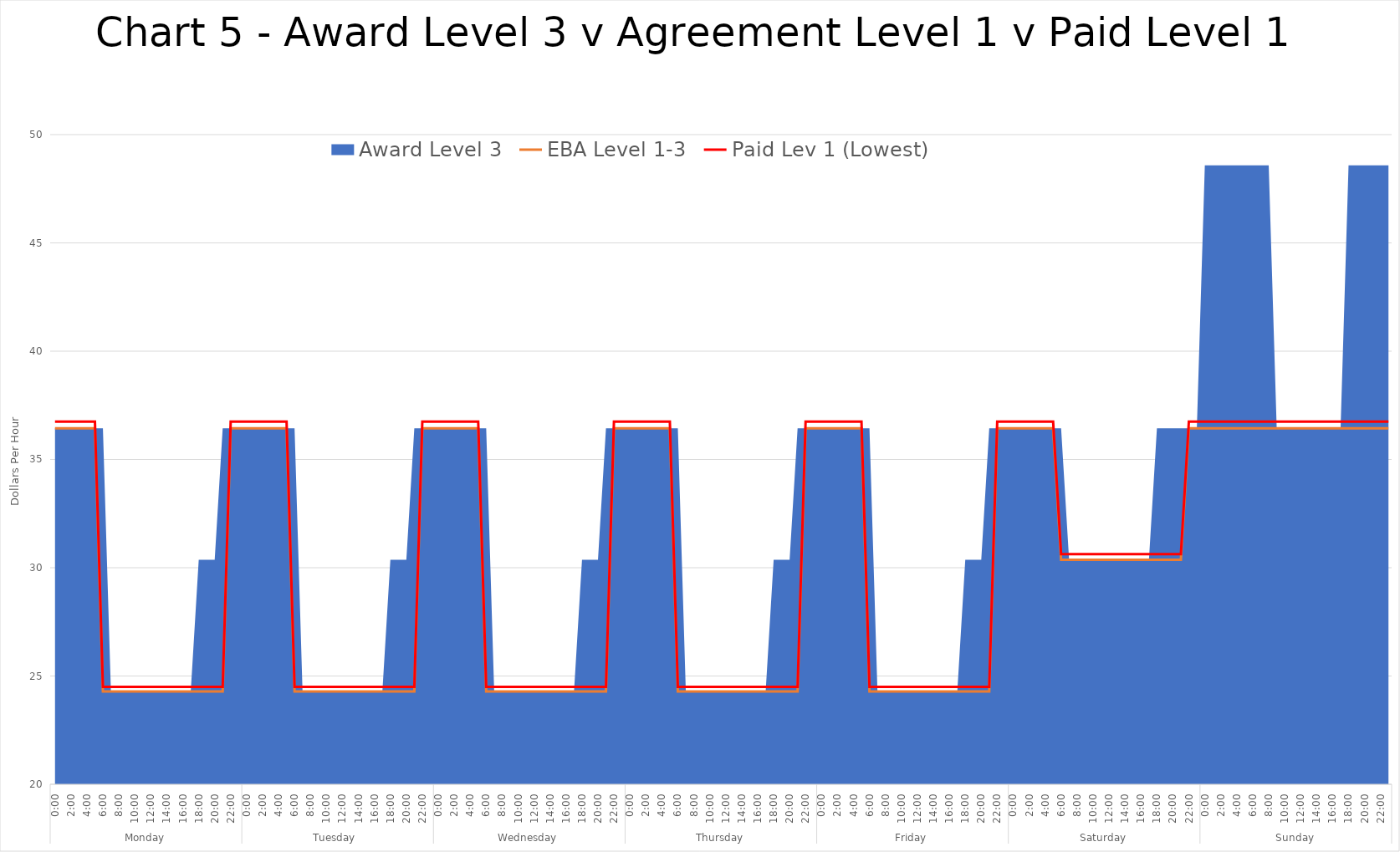
| Category | EBA Level 1-3 | Paid Lev 1 (Lowest) |
|---|---|---|
| 0 | 36.435 | 36.75 |
| 1 | 36.435 | 36.75 |
| 2 | 36.435 | 36.75 |
| 3 | 36.435 | 36.75 |
| 4 | 36.435 | 36.75 |
| 5 | 36.435 | 36.75 |
| 6 | 24.29 | 24.5 |
| 7 | 24.29 | 24.5 |
| 8 | 24.29 | 24.5 |
| 9 | 24.29 | 24.5 |
| 10 | 24.29 | 24.5 |
| 11 | 24.29 | 24.5 |
| 12 | 24.29 | 24.5 |
| 13 | 24.29 | 24.5 |
| 14 | 24.29 | 24.5 |
| 15 | 24.29 | 24.5 |
| 16 | 24.29 | 24.5 |
| 17 | 24.29 | 24.5 |
| 18 | 24.29 | 24.5 |
| 19 | 24.29 | 24.5 |
| 20 | 24.29 | 24.5 |
| 21 | 24.29 | 24.5 |
| 22 | 36.435 | 36.75 |
| 23 | 36.435 | 36.75 |
| 24 | 36.435 | 36.75 |
| 25 | 36.435 | 36.75 |
| 26 | 36.435 | 36.75 |
| 27 | 36.435 | 36.75 |
| 28 | 36.435 | 36.75 |
| 29 | 36.435 | 36.75 |
| 30 | 24.29 | 24.5 |
| 31 | 24.29 | 24.5 |
| 32 | 24.29 | 24.5 |
| 33 | 24.29 | 24.5 |
| 34 | 24.29 | 24.5 |
| 35 | 24.29 | 24.5 |
| 36 | 24.29 | 24.5 |
| 37 | 24.29 | 24.5 |
| 38 | 24.29 | 24.5 |
| 39 | 24.29 | 24.5 |
| 40 | 24.29 | 24.5 |
| 41 | 24.29 | 24.5 |
| 42 | 24.29 | 24.5 |
| 43 | 24.29 | 24.5 |
| 44 | 24.29 | 24.5 |
| 45 | 24.29 | 24.5 |
| 46 | 36.435 | 36.75 |
| 47 | 36.435 | 36.75 |
| 48 | 36.435 | 36.75 |
| 49 | 36.435 | 36.75 |
| 50 | 36.435 | 36.75 |
| 51 | 36.435 | 36.75 |
| 52 | 36.435 | 36.75 |
| 53 | 36.435 | 36.75 |
| 54 | 24.29 | 24.5 |
| 55 | 24.29 | 24.5 |
| 56 | 24.29 | 24.5 |
| 57 | 24.29 | 24.5 |
| 58 | 24.29 | 24.5 |
| 59 | 24.29 | 24.5 |
| 60 | 24.29 | 24.5 |
| 61 | 24.29 | 24.5 |
| 62 | 24.29 | 24.5 |
| 63 | 24.29 | 24.5 |
| 64 | 24.29 | 24.5 |
| 65 | 24.29 | 24.5 |
| 66 | 24.29 | 24.5 |
| 67 | 24.29 | 24.5 |
| 68 | 24.29 | 24.5 |
| 69 | 24.29 | 24.5 |
| 70 | 36.435 | 36.75 |
| 71 | 36.435 | 36.75 |
| 72 | 36.435 | 36.75 |
| 73 | 36.435 | 36.75 |
| 74 | 36.435 | 36.75 |
| 75 | 36.435 | 36.75 |
| 76 | 36.435 | 36.75 |
| 77 | 36.435 | 36.75 |
| 78 | 24.29 | 24.5 |
| 79 | 24.29 | 24.5 |
| 80 | 24.29 | 24.5 |
| 81 | 24.29 | 24.5 |
| 82 | 24.29 | 24.5 |
| 83 | 24.29 | 24.5 |
| 84 | 24.29 | 24.5 |
| 85 | 24.29 | 24.5 |
| 86 | 24.29 | 24.5 |
| 87 | 24.29 | 24.5 |
| 88 | 24.29 | 24.5 |
| 89 | 24.29 | 24.5 |
| 90 | 24.29 | 24.5 |
| 91 | 24.29 | 24.5 |
| 92 | 24.29 | 24.5 |
| 93 | 24.29 | 24.5 |
| 94 | 36.435 | 36.75 |
| 95 | 36.435 | 36.75 |
| 96 | 36.435 | 36.75 |
| 97 | 36.435 | 36.75 |
| 98 | 36.435 | 36.75 |
| 99 | 36.435 | 36.75 |
| 100 | 36.435 | 36.75 |
| 101 | 36.435 | 36.75 |
| 102 | 24.29 | 24.5 |
| 103 | 24.29 | 24.5 |
| 104 | 24.29 | 24.5 |
| 105 | 24.29 | 24.5 |
| 106 | 24.29 | 24.5 |
| 107 | 24.29 | 24.5 |
| 108 | 24.29 | 24.5 |
| 109 | 24.29 | 24.5 |
| 110 | 24.29 | 24.5 |
| 111 | 24.29 | 24.5 |
| 112 | 24.29 | 24.5 |
| 113 | 24.29 | 24.5 |
| 114 | 24.29 | 24.5 |
| 115 | 24.29 | 24.5 |
| 116 | 24.29 | 24.5 |
| 117 | 24.29 | 24.5 |
| 118 | 36.435 | 36.75 |
| 119 | 36.435 | 36.75 |
| 120 | 36.435 | 36.75 |
| 121 | 36.435 | 36.75 |
| 122 | 36.435 | 36.75 |
| 123 | 36.435 | 36.75 |
| 124 | 36.435 | 36.75 |
| 125 | 36.435 | 36.75 |
| 126 | 30.362 | 30.625 |
| 127 | 30.362 | 30.625 |
| 128 | 30.362 | 30.625 |
| 129 | 30.362 | 30.625 |
| 130 | 30.362 | 30.625 |
| 131 | 30.362 | 30.625 |
| 132 | 30.362 | 30.625 |
| 133 | 30.362 | 30.625 |
| 134 | 30.362 | 30.625 |
| 135 | 30.362 | 30.625 |
| 136 | 30.362 | 30.625 |
| 137 | 30.362 | 30.625 |
| 138 | 30.362 | 30.625 |
| 139 | 30.362 | 30.625 |
| 140 | 30.362 | 30.625 |
| 141 | 30.362 | 30.625 |
| 142 | 36.435 | 36.75 |
| 143 | 36.435 | 36.75 |
| 144 | 36.435 | 36.75 |
| 145 | 36.435 | 36.75 |
| 146 | 36.435 | 36.75 |
| 147 | 36.435 | 36.75 |
| 148 | 36.435 | 36.75 |
| 149 | 36.435 | 36.75 |
| 150 | 36.435 | 36.75 |
| 151 | 36.435 | 36.75 |
| 152 | 36.435 | 36.75 |
| 153 | 36.435 | 36.75 |
| 154 | 36.435 | 36.75 |
| 155 | 36.435 | 36.75 |
| 156 | 36.435 | 36.75 |
| 157 | 36.435 | 36.75 |
| 158 | 36.435 | 36.75 |
| 159 | 36.435 | 36.75 |
| 160 | 36.435 | 36.75 |
| 161 | 36.435 | 36.75 |
| 162 | 36.435 | 36.75 |
| 163 | 36.435 | 36.75 |
| 164 | 36.435 | 36.75 |
| 165 | 36.435 | 36.75 |
| 166 | 36.435 | 36.75 |
| 167 | 36.435 | 36.75 |